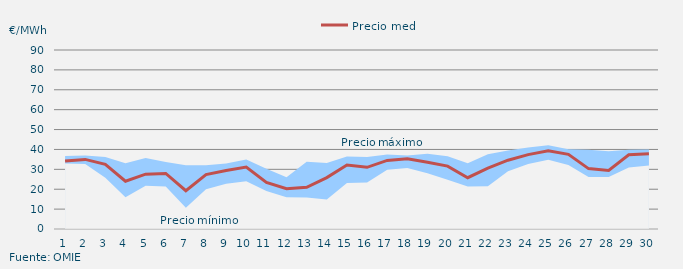
| Category | Precio medio |
|---|---|
| 1 | 34.2 |
| 2 | 34.996 |
| 3 | 32.553 |
| 4 | 24.038 |
| 5 | 27.553 |
| 6 | 27.916 |
| 7 | 19.252 |
| 8 | 27.372 |
| 9 | 29.427 |
| 10 | 31.168 |
| 11 | 23.427 |
| 12 | 20.211 |
| 13 | 20.962 |
| 14 | 25.853 |
| 15 | 32.213 |
| 16 | 31.019 |
| 17 | 34.47 |
| 18 | 35.299 |
| 19 | 33.608 |
| 20 | 31.599 |
| 21 | 25.795 |
| 22 | 30.601 |
| 23 | 34.579 |
| 24 | 37.412 |
| 25 | 39.374 |
| 26 | 37.559 |
| 27 | 30.361 |
| 28 | 29.474 |
| 29 | 37.292 |
| 30 | 37.793 |